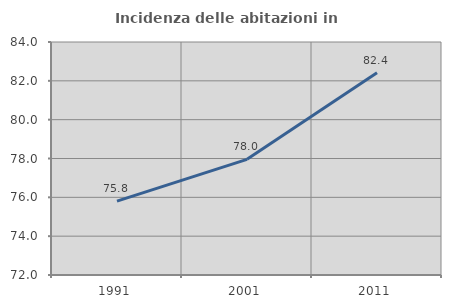
| Category | Incidenza delle abitazioni in proprietà  |
|---|---|
| 1991.0 | 75.803 |
| 2001.0 | 77.958 |
| 2011.0 | 82.412 |